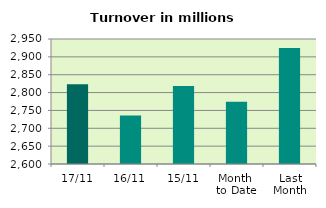
| Category | Series 0 |
|---|---|
| 17/11 | 2823.015 |
| 16/11 | 2735.657 |
| 15/11 | 2818.574 |
| Month 
to Date | 2774.066 |
| Last
Month | 2924.951 |